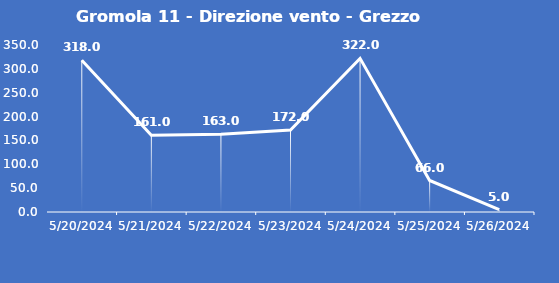
| Category | Gromola 11 - Direzione vento - Grezzo (°N) |
|---|---|
| 5/20/24 | 318 |
| 5/21/24 | 161 |
| 5/22/24 | 163 |
| 5/23/24 | 172 |
| 5/24/24 | 322 |
| 5/25/24 | 66 |
| 5/26/24 | 5 |